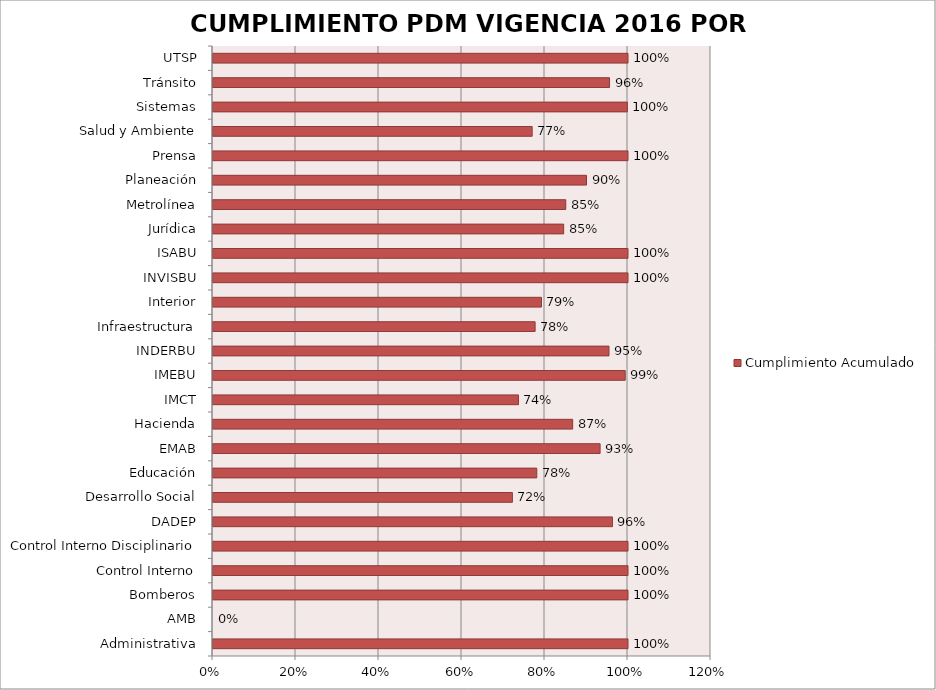
| Category | Cumplimiento Acumulado |
|---|---|
| Administrativa | 1 |
| AMB | 0 |
| Bomberos | 1 |
| Control Interno | 1 |
| Control Interno Disciplinario | 1 |
| DADEP | 0.962 |
| Desarrollo Social | 0.721 |
| Educación | 0.78 |
| EMAB | 0.933 |
| Hacienda | 0.867 |
| IMCT | 0.736 |
| IMEBU | 0.993 |
| INDERBU | 0.954 |
| Infraestructura | 0.776 |
| Interior | 0.791 |
| INVISBU | 1 |
| ISABU | 1 |
| Jurídica | 0.845 |
| Metrolínea | 0.85 |
| Planeación | 0.9 |
| Prensa | 1 |
| Salud y Ambiente | 0.769 |
| Sistemas | 0.998 |
| Tránsito | 0.956 |
| UTSP | 1 |